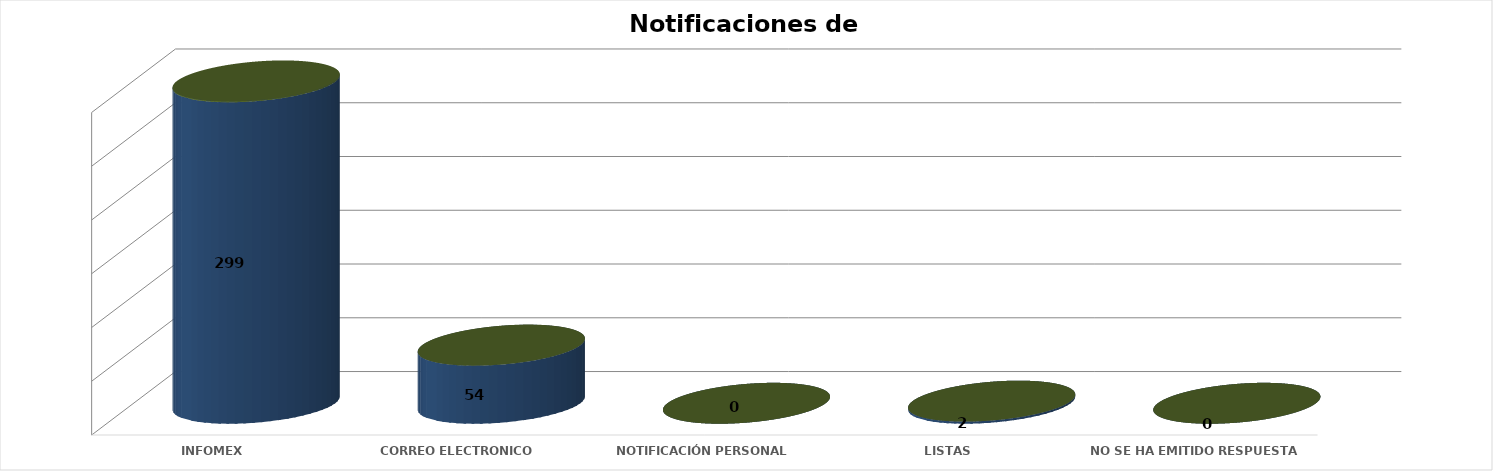
| Category | Series 0 | Series 1 | Series 2 | Series 3 | Series 4 |
|---|---|---|---|---|---|
| INFOMEX |  |  |  | 299 | 0.842 |
| CORREO ELECTRONICO |  |  |  | 54 | 0.152 |
| NOTIFICACIÓN PERSONAL |  |  |  | 0 | 0 |
| LISTAS |  |  |  | 2 | 0.006 |
|  NO SE HA EMITIDO RESPUESTA |  |  |  | 0 | 0 |